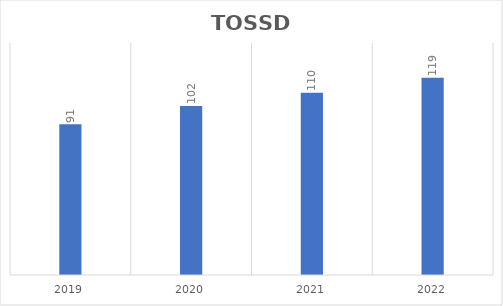
| Category | Series 0 |
|---|---|
| 2019.0 | 91 |
| 2020.0 | 102 |
| 2021.0 | 110 |
| 2022.0 | 119 |